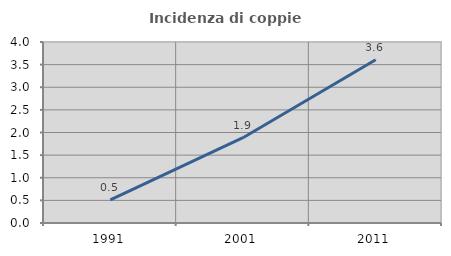
| Category | Incidenza di coppie miste |
|---|---|
| 1991.0 | 0.513 |
| 2001.0 | 1.885 |
| 2011.0 | 3.607 |